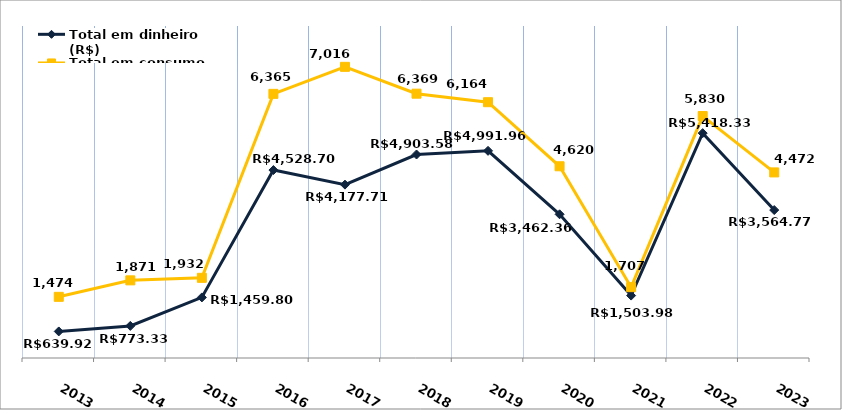
| Category | Total em dinheiro (R$) |
|---|---|
| 2013.0 | 639.92 |
| 2014.0 | 773.33 |
| 2015.0 | 1459.8 |
| 2016.0 | 4528.7 |
| 2017.0 | 4177.71 |
| 2018.0 | 4903.58 |
| 2019.0 | 4991.96 |
| 2020.0 | 3462.36 |
| 2021.0 | 1503.98 |
| 2022.0 | 5418.33 |
| 2023.0 | 3564.77 |